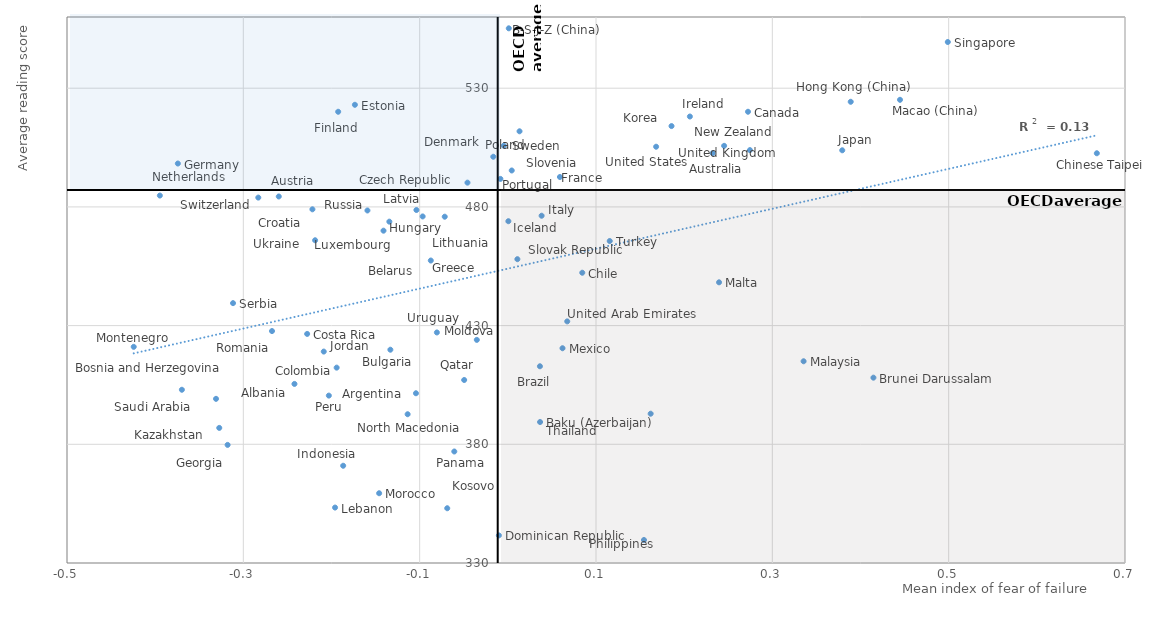
| Category | Series 0 |
|---|---|
| 0.0844308881239222 | 452.273 |
| -0.4243119067248109 | 421.058 |
| 0.3793029093610032 | 503.856 |
| 0.0620199125907967 | 420.469 |
| -0.327299441658312 | 386.909 |
| -0.0966151891946907 | 475.987 |
| 0.0590871792916871 | 492.606 |
| 0.2724093497314821 | 520.086 |
| -0.3116901067642505 | 439.466 |
| 0.4448091761133245 | 525.116 |
| -0.2145324255582137 | 424.358 |
| -0.2087859697489738 | 419.064 |
| 0.1681845825341327 | 505.353 |
| -0.104209814731847 | 401.503 |
| -0.0165193125628768 | 501.13 |
| 0.3354631295382562 | 414.98 |
| -0.1959630696355705 | 353.355 |
| -0.14596505144823 | 359.388 |
| 0.2064853373322573 | 518.078 |
| -0.2185990717592198 | 465.95 |
| 0.41466669749774 | 408.07 |
| 0.0044316269372875 | 495.346 |
| -0.049511936781318 | 407.092 |
| 0.038334486369849 | 476.285 |
| 0.2322990538527061 | 502.632 |
| -0.203022739370002 | 400.514 |
| -0.2216365935417578 | 478.989 |
| -0.3742744163035357 | 498.279 |
| -0.0607170547905823 | 376.971 |
| 0.2395607493581009 | 448.235 |
| -0.0101645563193568 | 341.626 |
| -0.2598095703504697 | 484.393 |
| -0.1592306181755387 | 478.502 |
| -0.2420065112320754 | 405.429 |
| -0.0457750446131831 | 490.219 |
| 0.0005985174705535 | 473.974 |
| -0.1332287777566162 | 419.844 |
| -0.173459615296142 | 523.017 |
| -0.0045663597852739 | 505.785 |
| -0.1036692384335327 | 478.699 |
| -0.2830291706302973 | 483.929 |
| 0.4990242034913292 | 549.465 |
| 0.1856683126156385 | 514.052 |
| -0.0351670718182708 | 423.993 |
| 0.2453244206089096 | 505.727 |
| 0.3889069082703135 | 524.283 |
| -0.1941502798929757 | 412.295 |
| 0.1155667681321592 | 465.632 |
| -0.3946915939318172 | 484.784 |
| -0.0715582320657606 | 475.873 |
| -0.3178278149605748 | 379.753 |
| 0.0010926294845741 | 555.236 |
| -0.3696947264464193 | 402.978 |
| 0.1619986391912245 | 392.889 |
| 0.0365757341536679 | 389.388 |
| -0.2674852219526758 | 427.703 |
| -0.1924199994818395 | 520.079 |
| 0.0132681902874078 | 511.856 |
| -0.0687314852542574 | 353.065 |
| -0.0084365309364588 | 491.801 |
| 0.0364010364374879 | 412.873 |
| -0.2276131609399768 | 426.498 |
| 0.0673735791495193 | 431.782 |
| 0.01082697252112 | 457.984 |
| -0.0804730478890442 | 427.118 |
| -0.1867590238245606 | 370.965 |
| -0.1136446889718701 | 392.668 |
| 0.6680581152674536 | 502.601 |
| -0.3309759112896273 | 399.152 |
| -0.0873703659794354 | 457.414 |
| 0.1543906505362997 | 339.692 |
| -0.1410075656276226 | 469.985 |
| -0.1343899035180029 | 473.788 |
| 0.2746110533586756 | 503.928 |